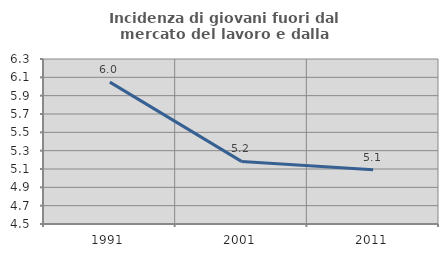
| Category | Incidenza di giovani fuori dal mercato del lavoro e dalla formazione  |
|---|---|
| 1991.0 | 6.048 |
| 2001.0 | 5.183 |
| 2011.0 | 5.091 |